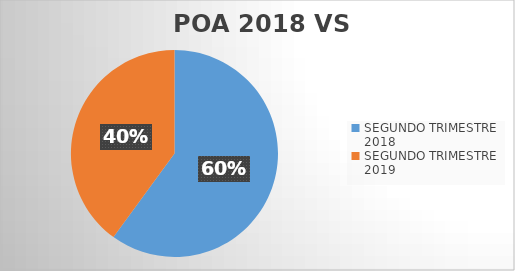
| Category | TOTAL CEDH |
|---|---|
| SEGUNDO TRIMESTRE 2018 | 48128 |
| SEGUNDO TRIMESTRE 2019 | 32036 |